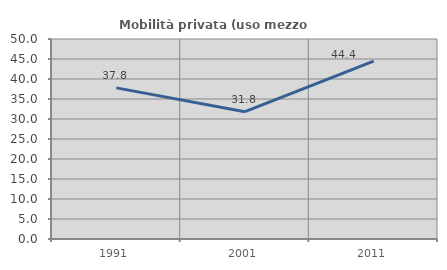
| Category | Mobilità privata (uso mezzo privato) |
|---|---|
| 1991.0 | 37.778 |
| 2001.0 | 31.818 |
| 2011.0 | 44.444 |